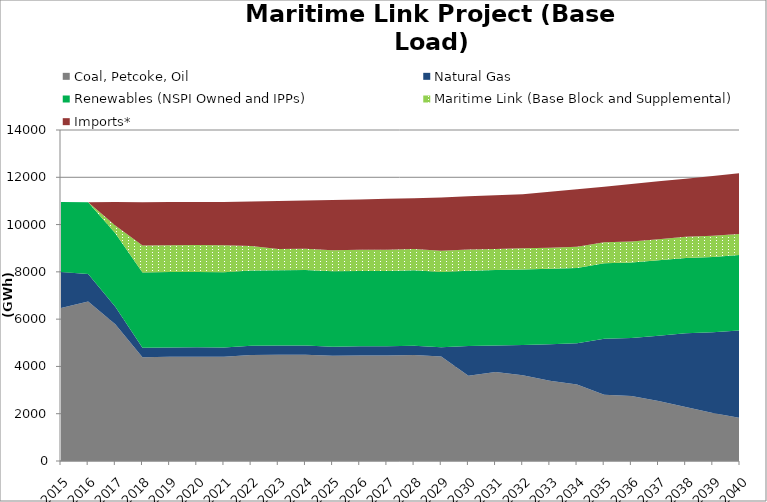
| Category | Coal, Petcoke, Oil | Natural Gas | Renewables (NSPI Owned and IPPs) | Maritime Link (Base Block and Supplemental) | Imports* |
|---|---|---|---|---|---|
| 2015.0 | 6470.622 | 1521.96 | 2959.036 | 0 | 0 |
| 2016.0 | 6748.166 | 1159.649 | 3041.159 | 0 | 0 |
| 2017.0 | 5782.183 | 741.454 | 3111.572 | 322.672 | 1000.663 |
| 2018.0 | 4391.175 | 397.368 | 3186.595 | 1135.312 | 1833.891 |
| 2019.0 | 4407.316 | 395.794 | 3186.595 | 1135.312 | 1828.764 |
| 2020.0 | 4410.568 | 396.001 | 3191.673 | 1139.355 | 1812.133 |
| 2021.0 | 4411.063 | 388.923 | 3186.595 | 1135.312 | 1835.828 |
| 2022.0 | 4480.771 | 390.773 | 3186.595 | 1038.224 | 1875.718 |
| 2023.0 | 4492.927 | 390.608 | 3186.595 | 894.98 | 2036.982 |
| 2024.0 | 4489.864 | 393.451 | 3191.673 | 897.432 | 2049.251 |
| 2025.0 | 4446.672 | 389.453 | 3186.595 | 894.98 | 2121.5 |
| 2026.0 | 4463.38 | 387.429 | 3186.595 | 894.98 | 2131.479 |
| 2027.0 | 4465.712 | 386.815 | 3186.595 | 894.98 | 2156.459 |
| 2028.0 | 4485.237 | 391.509 | 3191.672 | 897.432 | 2148.511 |
| 2029.0 | 4420.467 | 389.323 | 3186.595 | 894.98 | 2258.896 |
| 2030.0 | 3605.8 | 1257.5 | 3186.595 | 894.98 | 2248.435 |
| 2031.0 | 3766.758 | 1121.766 | 3186.594 | 894.98 | 2268.43 |
| 2032.0 | 3625.249 | 1280.593 | 3191.672 | 897.432 | 2286.003 |
| 2033.0 | 3399.189 | 1541.626 | 3186.595 | 894.98 | 2364.093 |
| 2034.0 | 3231.076 | 1748.041 | 3186.595 | 894.98 | 2433.188 |
| 2035.0 | 2804.328 | 2371.06 | 3186.595 | 894.98 | 2346.217 |
| 2036.0 | 2754.156 | 2444.963 | 3191.672 | 897.432 | 2426.179 |
| 2037.0 | 2540.697 | 2761.772 | 3186.595 | 894.98 | 2443.536 |
| 2038.0 | 2279.346 | 3123.193 | 3186.595 | 894.98 | 2456.878 |
| 2039.0 | 2027.968 | 3417.146 | 3186.595 | 894.98 | 2530.032 |
| 2040.0 | 1824.969 | 3694.83 | 3191.672 | 897.432 | 2565.488 |